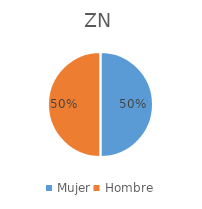
| Category | ZN |
|---|---|
| Mujer | 0.5 |
| Hombre | 0.5 |